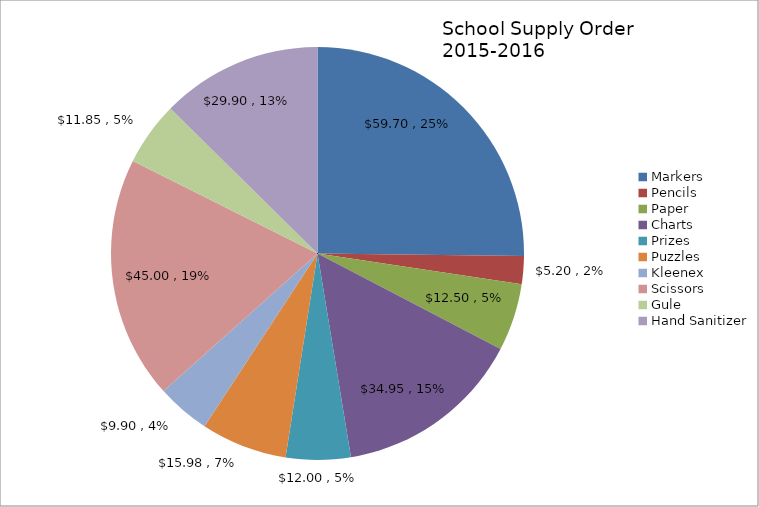
| Category | Series 0 |
|---|---|
| Markers | 59.7 |
| Pencils | 5.2 |
| Paper | 12.5 |
| Charts | 34.95 |
| Prizes | 12 |
| Puzzles | 15.98 |
| Kleenex | 9.9 |
| Scissors | 45 |
| Gule | 11.85 |
| Hand Sanitizer | 29.9 |